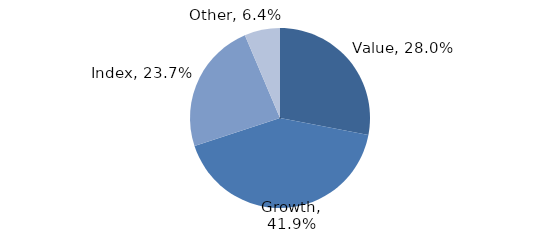
| Category | Investment Style |
|---|---|
| Value | 0.28 |
| Growth | 0.419 |
| Index | 0.237 |
| Other | 0.064 |